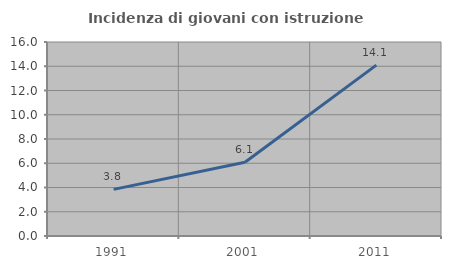
| Category | Incidenza di giovani con istruzione universitaria |
|---|---|
| 1991.0 | 3.846 |
| 2001.0 | 6.081 |
| 2011.0 | 14.089 |